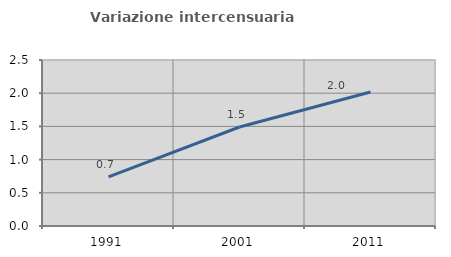
| Category | Variazione intercensuaria annua |
|---|---|
| 1991.0 | 0.741 |
| 2001.0 | 1.491 |
| 2011.0 | 2.017 |